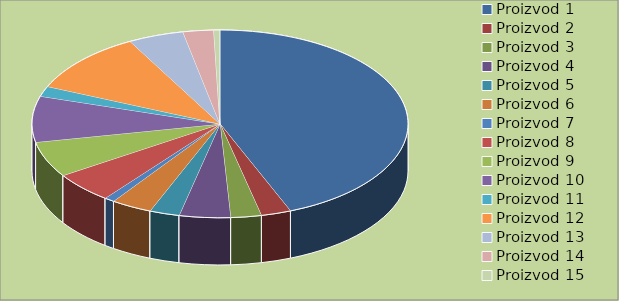
| Category | Series 0 |
|---|---|
| Proizvod 1 | 5000 |
| Proizvod 2 | 294 |
| Proizvod 3 | 300 |
| Proizvod 4 | 500 |
| Proizvod 5 | 294 |
| Proizvod 6 | 400 |
| Proizvod 7 | 100 |
| Proizvod 8 | 600 |
| Proizvod 9 | 700 |
| Proizvod 10 | 900 |
| Proizvod 11 | 200 |
| Proizvod 12 | 1200 |
| Proizvod 13 | 544 |
| Proizvod 14 | 300 |
| Proizvod 15 | 60 |